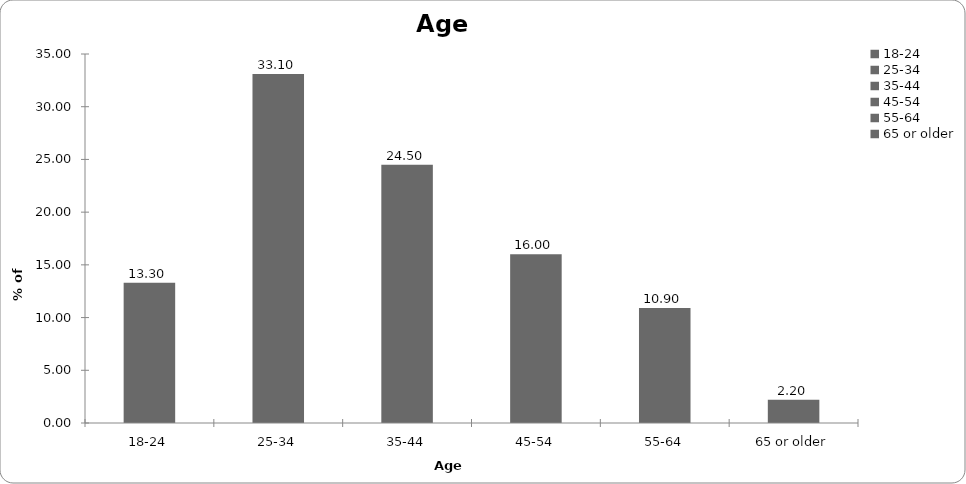
| Category | Age range |
|---|---|
| 18-24 | 13.3 |
| 25-34 | 33.1 |
| 35-44 | 24.5 |
| 45-54 | 16 |
| 55-64 | 10.9 |
| 65 or older | 2.2 |